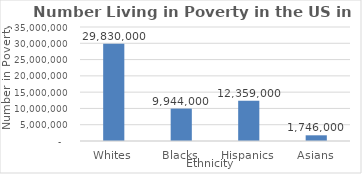
| Category | Number in Poverty (thousands) |
|---|---|
| Whites | 29830000 |
| Blacks | 9944000 |
| Hispanics | 12359000 |
| Asians | 1746000 |